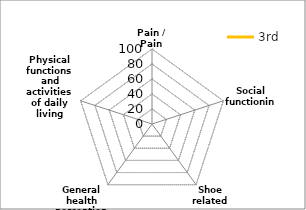
| Category | 3rd |
|---|---|
| Pain / Pain related | 0 |
| Social functioning | 0 |
| Shoe related | 0 |
| General health perceptions | 0 |
| Physical functions and activities of daily living (ADL) | 0 |